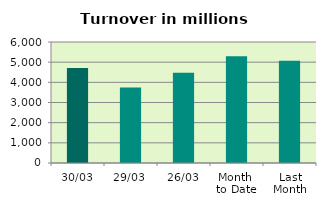
| Category | Series 0 |
|---|---|
| 30/03 | 4709.459 |
| 29/03 | 3745.956 |
| 26/03 | 4471.761 |
| Month 
to Date | 5296.462 |
| Last
Month | 5069.383 |